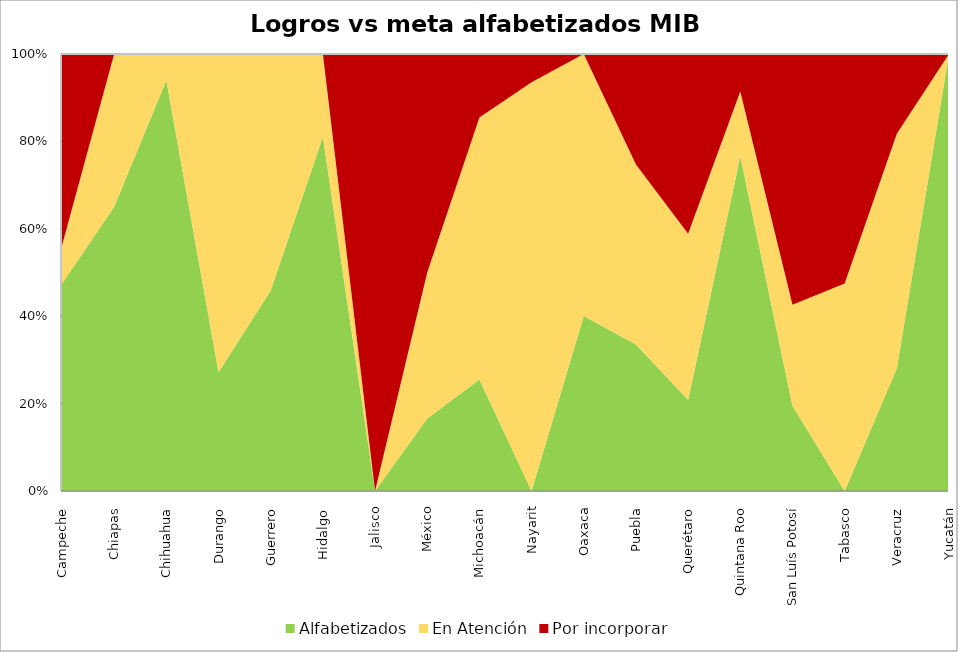
| Category | Alfabetizados | En Atención  | Por incorporar |
|---|---|---|---|
| Campeche | 0.474 | 0.088 | 0.438 |
| Chiapas | 0.652 | 0.35 | 0 |
| Chihuahua | 0.943 | 0.06 | 0 |
| Durango | 0.272 | 0.73 | 0 |
| Guerrero | 0.458 | 0.54 | 0 |
| Hidalgo  | 0.815 | 0.19 | 0 |
| Jalisco | 0 | 0 | 1 |
| México | 0.166 | 0.334 | 0.5 |
| Michoacán | 0.255 | 0.6 | 0.145 |
| Nayarit | 0 | 0.935 | 0.065 |
| Oaxaca | 0.401 | 0.6 | 0 |
| Puebla | 0.335 | 0.412 | 0.253 |
| Querétaro | 0.208 | 0.381 | 0.411 |
| Quintana Roo | 0.766 | 0.148 | 0.086 |
| San Luís Potosí | 0.195 | 0.231 | 0.574 |
| Tabasco | 0 | 0.475 | 0.525 |
| Veracruz | 0.281 | 0.536 | 0.183 |
| Yucatán | 1.013 | 0 | 0 |